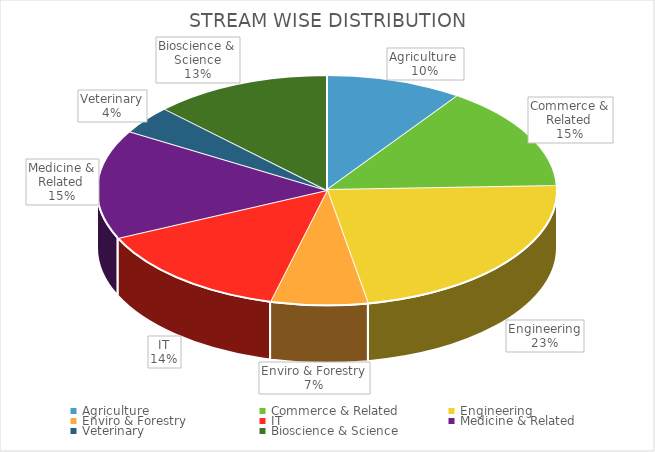
| Category | Series 0 |
|---|---|
| Agriculture  | 17 |
| Commerce & Related | 26 |
| Engineering | 40 |
| Enviro & Forestry | 12 |
| IT | 25 |
| Medicine & Related | 27 |
| Veterinary | 7 |
| Bioscience & Science | 22 |